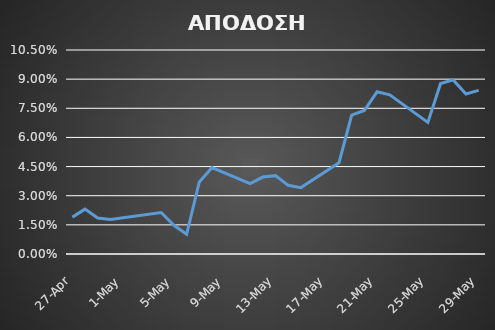
| Category | ΑΠΟΔΟΣΗ ΧΑΡΤΟΦΥΛΑΚΙΟΥ |
|---|---|
| 2015-04-27 | 0.019 |
| 2015-04-28 | 0.023 |
| 2015-04-29 | 0.019 |
| 2015-04-30 | 0.018 |
| 2015-05-04 | 0.021 |
| 2015-05-05 | 0.015 |
| 2015-05-06 | 0.01 |
| 2015-05-07 | 0.037 |
| 2015-05-08 | 0.044 |
| 2015-05-11 | 0.036 |
| 2015-05-12 | 0.04 |
| 2015-05-13 | 0.04 |
| 2015-05-14 | 0.035 |
| 2015-05-15 | 0.034 |
| 2015-05-18 | 0.047 |
| 2015-05-19 | 0.071 |
| 2015-05-20 | 0.074 |
| 2015-05-21 | 0.083 |
| 2015-05-22 | 0.082 |
| 2015-05-25 | 0.068 |
| 2015-05-26 | 0.088 |
| 2015-05-27 | 0.09 |
| 2015-05-28 | 0.082 |
| 2015-05-29 | 0.084 |